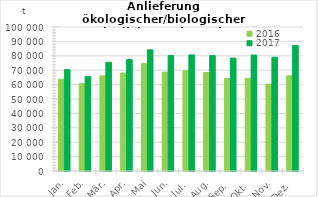
| Category | 2016 | 2017 |
|---|---|---|
| Jan. | 63733.941 | 70330.127 |
| Feb. | 60662.256 | 65694.657 |
| Mär. | 66118.934 | 75533.301 |
| Apr. | 68036.802 | 77378.195 |
| Mai | 74538.392 | 84146.522 |
| Jun. | 68680.734 | 80209.173 |
| Jul. | 69575.472 | 80637.01 |
| Aug. | 68371.672 | 80136.623 |
| Sep. | 64238.545 | 78406.509 |
| Okt. | 64319.735 | 80522.426 |
| Nov. | 60333.242 | 78991.121 |
| Dez. | 66107.865 | 87094.98 |